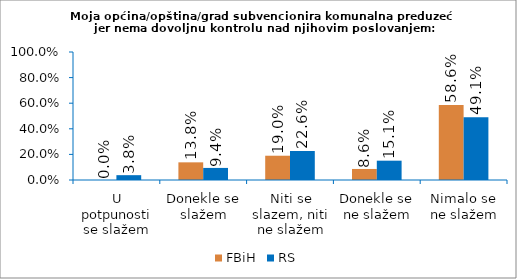
| Category | FBiH | RS |
|---|---|---|
| U potpunosti se slažem | 0 | 0.038 |
| Donekle se slažem | 0.138 | 0.094 |
| Niti se slazem, niti ne slažem | 0.19 | 0.226 |
| Donekle se ne slažem | 0.086 | 0.151 |
| Nimalo se ne slažem | 0.586 | 0.491 |